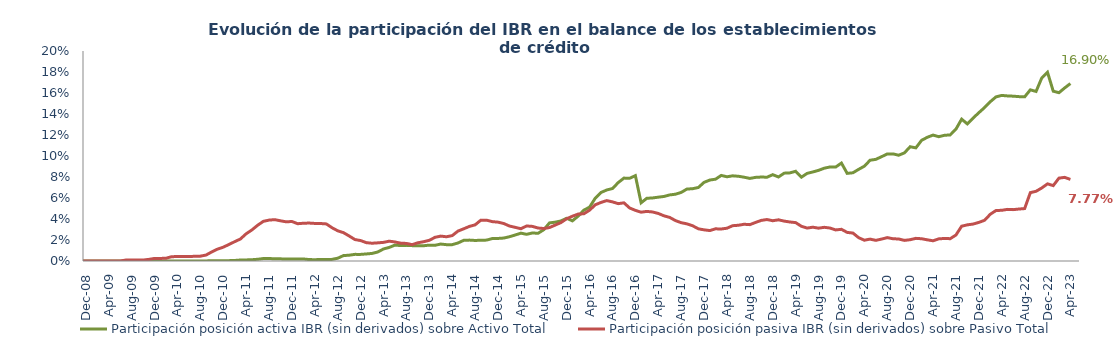
| Category | Participación posición activa IBR (sin derivados) sobre Activo Total | Participación posición pasiva IBR (sin derivados) sobre Pasivo Total |
|---|---|---|
| 2008-07-01 | 0 | 0 |
| 2008-08-01 | 0 | 0 |
| 2008-09-01 | 0 | 0 |
| 2008-10-01 | 0 | 0 |
| 2008-11-01 | 0 | 0 |
| 2008-12-01 | 0 | 0 |
| 2009-01-01 | 0 | 0 |
| 2009-02-01 | 0 | 0 |
| 2009-03-01 | 0 | 0 |
| 2009-04-01 | 0 | 0 |
| 2009-05-01 | 0 | 0 |
| 2009-06-01 | 0 | 0 |
| 2009-07-01 | 0 | 0.001 |
| 2009-08-01 | 0 | 0.001 |
| 2009-09-01 | 0 | 0.001 |
| 2009-10-01 | 0 | 0.001 |
| 2009-11-01 | 0 | 0.002 |
| 2009-12-01 | 0 | 0.002 |
| 2010-01-01 | 0 | 0.002 |
| 2010-02-01 | 0 | 0.003 |
| 2010-03-01 | 0 | 0.004 |
| 2010-04-01 | 0 | 0.004 |
| 2010-05-01 | 0 | 0.004 |
| 2010-06-01 | 0 | 0.004 |
| 2010-07-01 | 0 | 0.004 |
| 2010-08-01 | 0 | 0.005 |
| 2010-09-01 | 0 | 0.006 |
| 2010-10-01 | 0 | 0.009 |
| 2010-11-01 | 0 | 0.011 |
| 2010-12-01 | 0 | 0.013 |
| 2011-01-01 | 0 | 0.016 |
| 2011-02-01 | 0.001 | 0.018 |
| 2011-03-01 | 0.001 | 0.021 |
| 2011-04-01 | 0.001 | 0.026 |
| 2011-05-01 | 0.001 | 0.03 |
| 2011-06-01 | 0.002 | 0.034 |
| 2011-07-01 | 0.002 | 0.038 |
| 2011-08-01 | 0.002 | 0.039 |
| 2011-09-01 | 0.002 | 0.039 |
| 2011-10-01 | 0.002 | 0.038 |
| 2011-11-01 | 0.002 | 0.037 |
| 2011-12-01 | 0.002 | 0.038 |
| 2012-01-01 | 0.002 | 0.036 |
| 2012-02-01 | 0.002 | 0.036 |
| 2012-03-01 | 0.001 | 0.036 |
| 2012-04-01 | 0.001 | 0.036 |
| 2012-05-01 | 0.001 | 0.036 |
| 2012-06-01 | 0.002 | 0.035 |
| 2012-07-01 | 0.002 | 0.032 |
| 2012-08-01 | 0.003 | 0.029 |
| 2012-09-01 | 0.005 | 0.027 |
| 2012-10-01 | 0.006 | 0.024 |
| 2012-11-01 | 0.006 | 0.02 |
| 2012-12-01 | 0.006 | 0.019 |
| 2013-01-01 | 0.007 | 0.017 |
| 2013-02-01 | 0.007 | 0.017 |
| 2013-03-01 | 0.009 | 0.017 |
| 2013-04-01 | 0.011 | 0.018 |
| 2013-05-01 | 0.013 | 0.019 |
| 2013-06-01 | 0.015 | 0.018 |
| 2013-07-01 | 0.015 | 0.017 |
| 2013-08-01 | 0.015 | 0.017 |
| 2013-09-01 | 0.015 | 0.016 |
| 2013-10-01 | 0.015 | 0.017 |
| 2013-11-01 | 0.015 | 0.018 |
| 2013-12-01 | 0.015 | 0.02 |
| 2014-01-01 | 0.015 | 0.023 |
| 2014-02-01 | 0.016 | 0.024 |
| 2014-03-01 | 0.016 | 0.023 |
| 2014-04-01 | 0.016 | 0.024 |
| 2014-05-01 | 0.017 | 0.028 |
| 2014-06-01 | 0.02 | 0.031 |
| 2014-07-01 | 0.02 | 0.033 |
| 2014-08-01 | 0.02 | 0.034 |
| 2014-09-01 | 0.02 | 0.039 |
| 2014-10-01 | 0.02 | 0.039 |
| 2014-11-01 | 0.021 | 0.038 |
| 2014-12-01 | 0.021 | 0.037 |
| 2015-01-01 | 0.022 | 0.036 |
| 2015-02-01 | 0.023 | 0.033 |
| 2015-03-01 | 0.025 | 0.032 |
| 2015-04-01 | 0.027 | 0.031 |
| 2015-05-01 | 0.025 | 0.033 |
| 2015-06-01 | 0.027 | 0.033 |
| 2015-07-01 | 0.026 | 0.031 |
| 2015-08-01 | 0.03 | 0.031 |
| 2015-09-01 | 0.036 | 0.032 |
| 2015-10-01 | 0.037 | 0.034 |
| 2015-11-01 | 0.038 | 0.037 |
| 2015-12-01 | 0.041 | 0.04 |
| 2016-01-01 | 0.038 | 0.043 |
| 2016-02-01 | 0.043 | 0.045 |
| 2016-03-01 | 0.048 | 0.045 |
| 2016-04-01 | 0.051 | 0.048 |
| 2016-05-01 | 0.06 | 0.054 |
| 2016-06-01 | 0.065 | 0.056 |
| 2016-07-01 | 0.068 | 0.058 |
| 2016-08-01 | 0.069 | 0.056 |
| 2016-09-01 | 0.075 | 0.055 |
| 2016-10-01 | 0.079 | 0.055 |
| 2016-11-01 | 0.079 | 0.05 |
| 2016-12-01 | 0.081 | 0.048 |
| 2017-01-01 | 0.055 | 0.046 |
| 2017-02-01 | 0.06 | 0.047 |
| 2017-03-01 | 0.06 | 0.047 |
| 2017-04-01 | 0.061 | 0.045 |
| 2017-05-01 | 0.061 | 0.043 |
| 2017-06-01 | 0.063 | 0.041 |
| 2017-07-01 | 0.064 | 0.038 |
| 2017-08-01 | 0.065 | 0.036 |
| 2017-09-01 | 0.069 | 0.035 |
| 2017-10-01 | 0.069 | 0.034 |
| 2017-11-01 | 0.07 | 0.031 |
| 2017-12-01 | 0.075 | 0.03 |
| 2018-01-01 | 0.077 | 0.029 |
| 2018-02-01 | 0.078 | 0.031 |
| 2018-03-01 | 0.081 | 0.03 |
| 2018-04-01 | 0.08 | 0.031 |
| 2018-05-01 | 0.081 | 0.034 |
| 2018-06-01 | 0.081 | 0.034 |
| 2018-07-01 | 0.08 | 0.035 |
| 2018-08-01 | 0.079 | 0.035 |
| 2018-09-01 | 0.08 | 0.037 |
| 2018-10-01 | 0.08 | 0.039 |
| 2018-11-01 | 0.08 | 0.039 |
| 2018-12-01 | 0.082 | 0.038 |
| 2019-01-01 | 0.08 | 0.039 |
| 2019-02-01 | 0.084 | 0.038 |
| 2019-03-01 | 0.084 | 0.037 |
| 2019-04-01 | 0.085 | 0.037 |
| 2019-05-01 | 0.08 | 0.033 |
| 2019-06-01 | 0.083 | 0.031 |
| 2019-07-01 | 0.085 | 0.032 |
| 2019-08-01 | 0.086 | 0.031 |
| 2019-09-01 | 0.088 | 0.032 |
| 2019-10-01 | 0.09 | 0.031 |
| 2019-11-01 | 0.09 | 0.03 |
| 2019-12-01 | 0.093 | 0.03 |
| 2020-01-01 | 0.083 | 0.027 |
| 2020-02-01 | 0.084 | 0.027 |
| 2020-03-01 | 0.087 | 0.022 |
| 2020-04-01 | 0.09 | 0.02 |
| 2020-05-01 | 0.096 | 0.021 |
| 2020-06-01 | 0.097 | 0.02 |
| 2020-07-01 | 0.099 | 0.021 |
| 2020-08-01 | 0.102 | 0.022 |
| 2020-09-01 | 0.102 | 0.021 |
| 2020-10-01 | 0.101 | 0.021 |
| 2020-11-01 | 0.103 | 0.02 |
| 2020-12-01 | 0.109 | 0.02 |
| 2021-01-01 | 0.108 | 0.022 |
| 2021-02-01 | 0.115 | 0.021 |
| 2021-03-01 | 0.118 | 0.02 |
| 2021-04-01 | 0.12 | 0.019 |
| 2021-05-01 | 0.118 | 0.021 |
| 2021-06-01 | 0.12 | 0.021 |
| 2021-07-01 | 0.12 | 0.021 |
| 2021-08-01 | 0.126 | 0.025 |
| 2021-09-01 | 0.135 | 0.033 |
| 2021-10-01 | 0.131 | 0.034 |
| 2021-11-01 | 0.136 | 0.035 |
| 2021-12-01 | 0.141 | 0.037 |
| 2022-01-01 | 0.146 | 0.039 |
| 2022-02-01 | 0.152 | 0.045 |
| 2022-03-01 | 0.156 | 0.048 |
| 2022-04-01 | 0.158 | 0.048 |
| 2022-05-01 | 0.157 | 0.049 |
| 2022-06-01 | 0.157 | 0.049 |
| 2022-07-01 | 0.157 | 0.049 |
| 2022-08-01 | 0.156 | 0.05 |
| 2022-09-01 | 0.163 | 0.065 |
| 2022-10-01 | 0.161 | 0.066 |
| 2022-11-01 | 0.174 | 0.07 |
| 2022-12-01 | 0.18 | 0.073 |
| 2023-01-01 | 0.162 | 0.072 |
| 2023-02-01 | 0.16 | 0.079 |
| 2023-03-01 | 0.165 | 0.08 |
| 2023-04-01 | 0.169 | 0.078 |